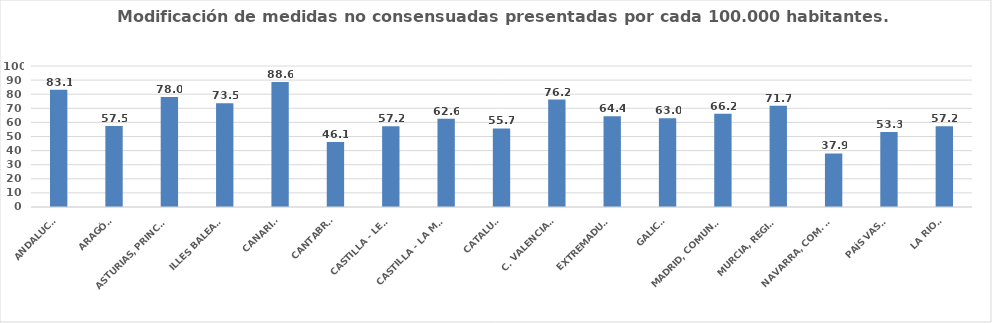
| Category | Series 0 |
|---|---|
| ANDALUCÍA | 83.14 |
| ARAGÓN | 57.528 |
| ASTURIAS, PRINCIPADO | 78.034 |
| ILLES BALEARS | 73.513 |
| CANARIAS | 88.626 |
| CANTABRIA | 46.122 |
| CASTILLA - LEÓN | 57.236 |
| CASTILLA - LA MANCHA | 62.581 |
| CATALUÑA | 55.707 |
| C. VALENCIANA | 76.226 |
| EXTREMADURA | 64.374 |
| GALICIA | 62.963 |
| MADRID, COMUNIDAD | 66.204 |
| MURCIA, REGIÓN | 71.742 |
| NAVARRA, COM. FORAL | 37.945 |
| PAÍS VASCO | 53.257 |
| LA RIOJA | 57.207 |